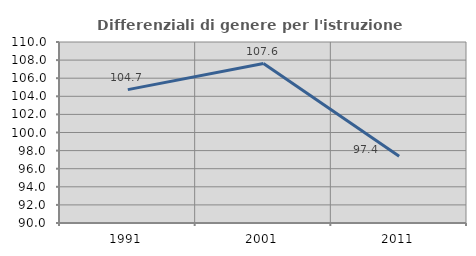
| Category | Differenziali di genere per l'istruzione superiore |
|---|---|
| 1991.0 | 104.737 |
| 2001.0 | 107.616 |
| 2011.0 | 97.372 |